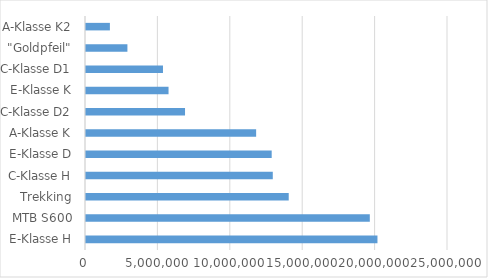
| Category | Umsätze |
|---|---|
| E-Klasse H | 20128000 |
| MTB S600 | 19600000 |
| Trekking | 14000000 |
| C-Klasse H | 12900000 |
| E-Klasse D | 12824000 |
| A-Klasse K | 11750000 |
| C-Klasse D2 | 6839000 |
| E-Klasse K | 5700000 |
| C-Klasse D1 | 5316000 |
| "Goldpfeil" | 2860000 |
| A-Klasse K2 | 1650000 |